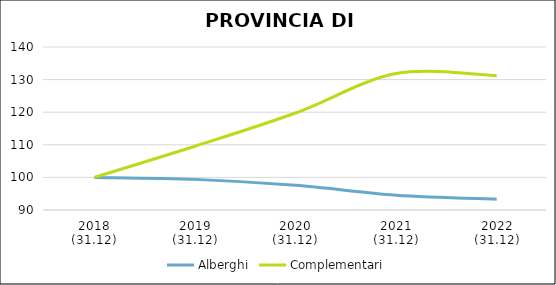
| Category | Alberghi | Complementari |
|---|---|---|
| 2018
(31.12) | 100 | 100 |
| 2019
(31.12) | 99.394 | 109.554 |
| 2020
(31.12) | 97.576 | 119.745 |
| 2021
(31.12) | 94.545 | 131.847 |
| 2022
(31.12) | 93.333 | 131.21 |